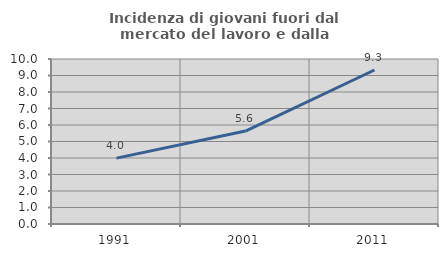
| Category | Incidenza di giovani fuori dal mercato del lavoro e dalla formazione  |
|---|---|
| 1991.0 | 3.993 |
| 2001.0 | 5.632 |
| 2011.0 | 9.332 |